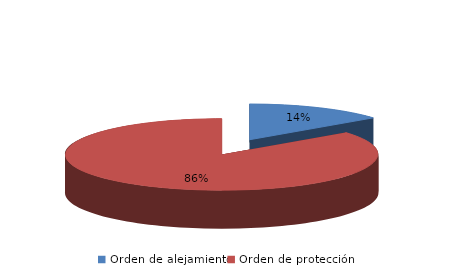
| Category | Series 0 |
|---|---|
| Orden de alejamiento | 108 |
| Orden de protección | 637 |